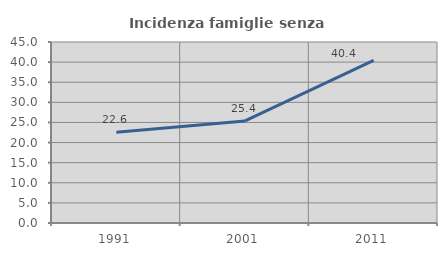
| Category | Incidenza famiglie senza nuclei |
|---|---|
| 1991.0 | 22.559 |
| 2001.0 | 25.383 |
| 2011.0 | 40.429 |